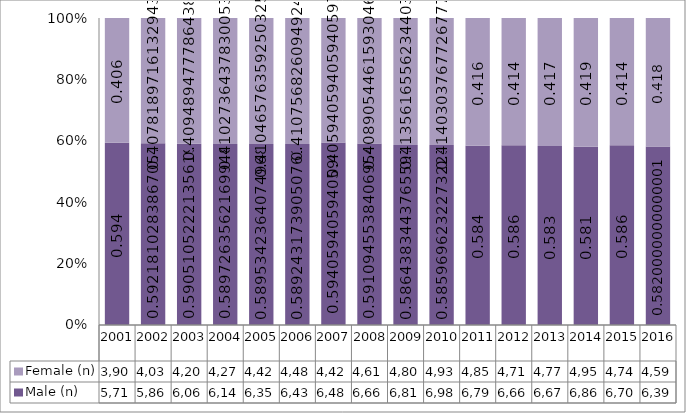
| Category | Male (n) | Female (n) |
|---|---|---|
| 2001.0 | 5716 | 3906 |
| 2002.0 | 5862 | 4037 |
| 2003.0 | 6061 | 4203 |
| 2004.0 | 6142 | 4273 |
| 2005.0 | 6354 | 4424 |
| 2006.0 | 6431 | 4483 |
| 2007.0 | 6480 | 4428 |
| 2008.0 | 6664 | 4610 |
| 2009.0 | 6815 | 4806 |
| 2010.0 | 6983 | 4934 |
| 2011.0 | 6798 | 4852 |
| 2012.0 | 6669 | 4714 |
| 2013.0 | 6670 | 4773 |
| 2014.0 | 6861 | 4958 |
| 2015.0 | 6709 | 4744 |
| 2016.0 | 6391 | 4599 |